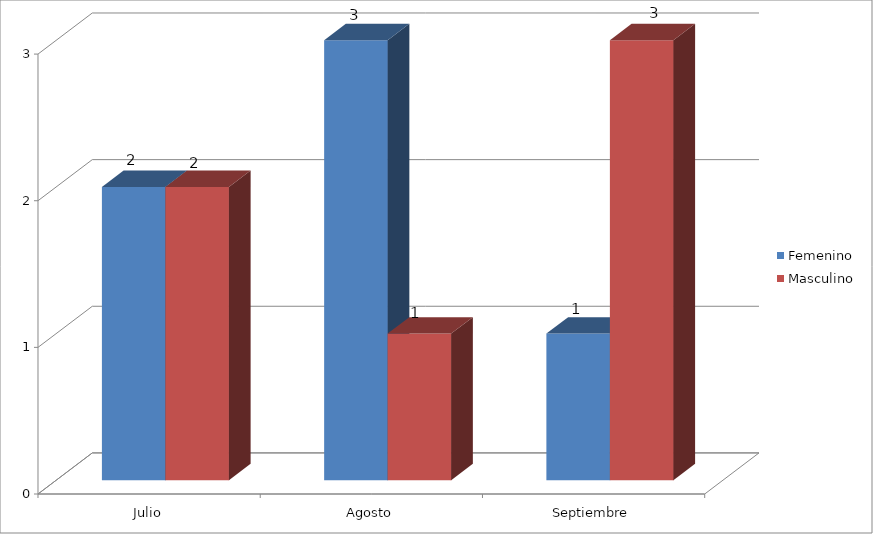
| Category | Femenino | Masculino |
|---|---|---|
| Julio | 2 | 2 |
| Agosto | 3 | 1 |
| Septiembre | 1 | 3 |